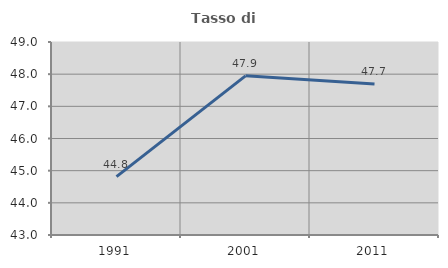
| Category | Tasso di occupazione   |
|---|---|
| 1991.0 | 44.813 |
| 2001.0 | 47.948 |
| 2011.0 | 47.693 |